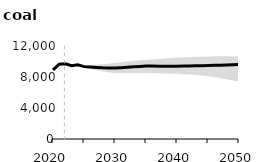
| Category | Ref |
|---|---|
| 2020.0 | 8914.891 |
| 2021.0 | 9657.695 |
| 2022.0 | 9696.399 |
| 2023.0 | 9445.471 |
| 2024.0 | 9568.053 |
| 2025.0 | 9338.615 |
| 2026.0 | 9277.957 |
| 2027.0 | 9227.215 |
| 2028.0 | 9178.926 |
| 2029.0 | 9156.783 |
| 2030.0 | 9164.896 |
| 2031.0 | 9206.883 |
| 2032.0 | 9253.432 |
| 2033.0 | 9312.902 |
| 2034.0 | 9360.974 |
| 2035.0 | 9411.606 |
| 2036.0 | 9409.362 |
| 2037.0 | 9402.248 |
| 2038.0 | 9391.19 |
| 2039.0 | 9384.611 |
| 2040.0 | 9377.691 |
| 2041.0 | 9403.333 |
| 2042.0 | 9426.99 |
| 2043.0 | 9447.398 |
| 2044.0 | 9459.792 |
| 2045.0 | 9475.406 |
| 2046.0 | 9500.186 |
| 2047.0 | 9529.837 |
| 2048.0 | 9554.1 |
| 2049.0 | 9586.853 |
| 2050.0 | 9611.623 |